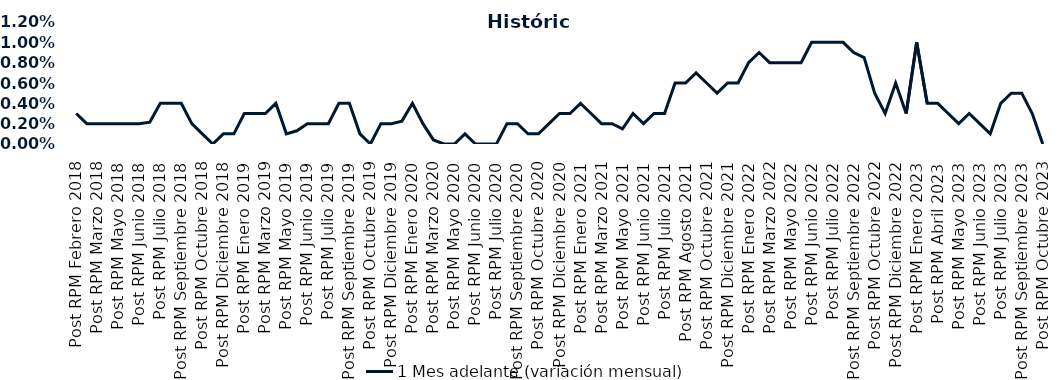
| Category | 1 Mes adelante (variación mensual) |
|---|---|
| Post RPM Febrero 2018 | 0.003 |
| Pre RPM Marzo 2018 | 0.002 |
| Post RPM Marzo 2018 | 0.002 |
| Pre RPM Mayo 2018 | 0.002 |
| Post RPM Mayo 2018 | 0.002 |
| Pre RPM Junio 2018 | 0.002 |
| Post RPM Junio 2018 | 0.002 |
| Pre RPM Julio 2018 | 0.002 |
| Post RPM Julio 2018 | 0.004 |
| Pre RPM Septiembre 2018 | 0.004 |
| Post RPM Septiembre 2018 | 0.004 |
| Pre RPM Octubre 2018 | 0.002 |
| Post RPM Octubre 2018 | 0.001 |
| Pre RPM Diciembre 2018 | 0 |
| Post RPM Diciembre 2018 | 0.001 |
| Pre RPM Enero 2019 | 0.001 |
| Post RPM Enero 2019 | 0.003 |
| Pre RPM Marzo 2019 | 0.003 |
| Post RPM Marzo 2019 | 0.003 |
| Pre RPM Mayo 2019 | 0.004 |
| Post RPM Mayo 2019 | 0.001 |
| Pre RPM Junio 2019 | 0.001 |
| Post RPM Junio 2019 | 0.002 |
| Pre RPM Julio 2019 | 0.002 |
| Post RPM Julio 2019 | 0.002 |
| Pre RPM Septiembre 2019 | 0.004 |
| Post RPM Septiembre 2019 | 0.004 |
| Pre RPM Octubre 2019 | 0.001 |
| Post RPM Octubre 2019 | 0 |
| Pre RPM Diciembre 2019 | 0.002 |
| Post RPM Diciembre 2019 | 0.002 |
| Pre RPM Enero 2020 | 0.002 |
| Post RPM Enero 2020 | 0.004 |
| Pre RPM Marzo 2020 | 0.002 |
| Post RPM Marzo 2020 | 0 |
| Pre RPM Mayo 2020 | 0 |
| Post RPM Mayo 2020 | 0 |
| Pre RPM Junio 2020 | 0.001 |
| Post RPM Junio 2020 | 0 |
| Pre RPM Julio 2020 | 0 |
| Post RPM Julio 2020 | 0 |
| Pre RPM Septiembre 2020 | 0.002 |
| Post RPM Septiembre 2020 | 0.002 |
| Pre RPM Octubre 2020 | 0.001 |
| Post RPM Octubre 2020 | 0.001 |
| Pre RPM Diciembre 2020 | 0.002 |
| Post RPM Diciembre 2020 | 0.003 |
| Pre RPM Enero 2021 | 0.003 |
| Post RPM Enero 2021 | 0.004 |
| Pre RPM Marzo 2021 | 0.003 |
| Post RPM Marzo 2021 | 0.002 |
| Pre RPM Mayo 2021 | 0.002 |
| Post RPM Mayo 2021 | 0.002 |
| Pre RPM Junio 2021 | 0.003 |
| Post RPM Junio 2021 | 0.002 |
| Pre RPM Julio 2021 | 0.003 |
| Post RPM Julio 2021 | 0.003 |
| Pre RPM Agosto 2021 | 0.006 |
| Post RPM Agosto 2021 | 0.006 |
| Pre RPM Octubre 2021 | 0.007 |
| Post RPM Octubre 2021 | 0.006 |
| Pre RPM Diciembre 2021 | 0.005 |
| Post RPM Diciembre 2021 | 0.006 |
| Pre RPM Enero 2022 | 0.006 |
| Post RPM Enero 2022 | 0.008 |
| Pre RPM Marzo 2022 | 0.009 |
| Post RPM Marzo 2022 | 0.008 |
| Pre RPM Mayo 2022 | 0.008 |
| Post RPM Mayo 2022 | 0.008 |
| Pre RPM Junio 2022 | 0.008 |
| Post RPM Junio 2022 | 0.01 |
| Pre RPM Julio 2022 | 0.01 |
| Post RPM Julio 2022 | 0.01 |
| Pre RPM Septiembre 2022 | 0.01 |
| Post RPM Septiembre 2022 | 0.009 |
| Pre RPM Octubre 2022 | 0.008 |
| Post RPM Octubre 2022 | 0.005 |
| Pre RPM Diciembre 2022 | 0.003 |
| Post RPM Diciembre 2022 | 0.006 |
| Pre RPM Enero 2023 | 0.003 |
| Post RPM Enero 2023 | 0.01 |
| Pre RPM Abril 2023 | 0.004 |
| Post RPM Abril 2023 | 0.004 |
| Pre RPM Mayo 2023 | 0.003 |
| Post RPM Mayo 2023 | 0.002 |
| Pre RPM Junio 2023 | 0.003 |
| Post RPM Junio 2023 | 0.002 |
| Pre RPM Julio 2023 | 0.001 |
| Post RPM Julio 2023 | 0.004 |
| Pre RPM Septiembre 2023 | 0.005 |
| Post RPM Septiembre 2023 | 0.005 |
| Pre RPM Octubre 2023 | 0.003 |
| Post RPM Octubre 2023 | 0 |